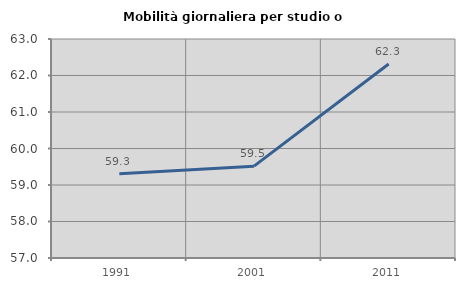
| Category | Mobilità giornaliera per studio o lavoro |
|---|---|
| 1991.0 | 59.31 |
| 2001.0 | 59.516 |
| 2011.0 | 62.317 |